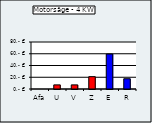
| Category | Motorsäge - 4 KW |
|---|---|
| Afa | 0 |
| U | 7 |
| V | 7 |
| Z | 21 |
| E | 59.5 |
| R | 17.5 |